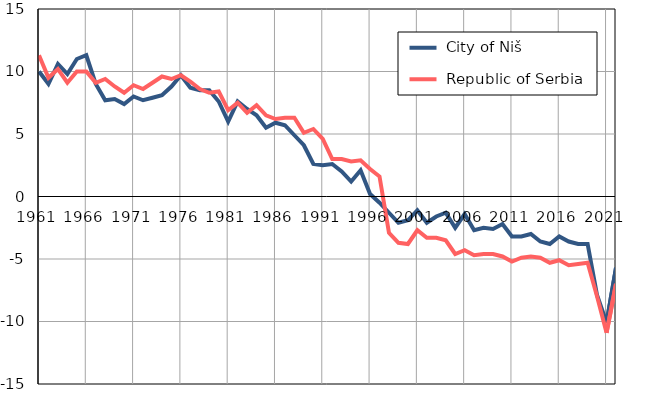
| Category |  City of Niš |  Republic of Serbia |
|---|---|---|
| 1961.0 | 10 | 11.3 |
| 1962.0 | 9 | 9.5 |
| 1963.0 | 10.6 | 10.2 |
| 1964.0 | 9.8 | 9.1 |
| 1965.0 | 11 | 10 |
| 1966.0 | 11.3 | 10 |
| 1967.0 | 9 | 9.1 |
| 1968.0 | 7.7 | 9.4 |
| 1969.0 | 7.8 | 8.8 |
| 1970.0 | 7.4 | 8.3 |
| 1971.0 | 8 | 8.9 |
| 1972.0 | 7.7 | 8.6 |
| 1973.0 | 7.9 | 9.1 |
| 1974.0 | 8.1 | 9.6 |
| 1975.0 | 8.8 | 9.4 |
| 1976.0 | 9.7 | 9.7 |
| 1977.0 | 8.7 | 9.2 |
| 1978.0 | 8.5 | 8.6 |
| 1979.0 | 8.5 | 8.3 |
| 1980.0 | 7.6 | 8.4 |
| 1981.0 | 6 | 6.9 |
| 1982.0 | 7.6 | 7.5 |
| 1983.0 | 7 | 6.7 |
| 1984.0 | 6.5 | 7.3 |
| 1985.0 | 5.5 | 6.5 |
| 1986.0 | 5.9 | 6.2 |
| 1987.0 | 5.7 | 6.3 |
| 1988.0 | 4.9 | 6.3 |
| 1989.0 | 4.1 | 5.1 |
| 1990.0 | 2.6 | 5.4 |
| 1991.0 | 2.5 | 4.6 |
| 1992.0 | 2.6 | 3 |
| 1993.0 | 2 | 3 |
| 1994.0 | 1.2 | 2.8 |
| 1995.0 | 2.1 | 2.9 |
| 1996.0 | 0.2 | 2.2 |
| 1997.0 | -0.5 | 1.6 |
| 1998.0 | -1.3 | -2.9 |
| 1999.0 | -2.1 | -3.7 |
| 2000.0 | -1.9 | -3.8 |
| 2001.0 | -1.1 | -2.7 |
| 2002.0 | -2.1 | -3.3 |
| 2003.0 | -1.6 | -3.3 |
| 2004.0 | -1.3 | -3.5 |
| 2005.0 | -2.5 | -4.6 |
| 2006.0 | -1.4 | -4.3 |
| 2007.0 | -2.7 | -4.7 |
| 2008.0 | -2.5 | -4.6 |
| 2009.0 | -2.6 | -4.6 |
| 2010.0 | -2.2 | -4.8 |
| 2011.0 | -3.2 | -5.2 |
| 2012.0 | -3.2 | -4.9 |
| 2013.0 | -3 | -4.8 |
| 2014.0 | -3.6 | -4.9 |
| 2015.0 | -3.8 | -5.3 |
| 2016.0 | -3.2 | -5.1 |
| 2017.0 | -3.6 | -5.5 |
| 2018.0 | -3.8 | -5.4 |
| 2019.0 | -3.8 | -5.3 |
| 2020.0 | -7.9 | -8 |
| 2021.0 | -10.1 | -10.9 |
| 2022.0 | -5.7 | -7 |